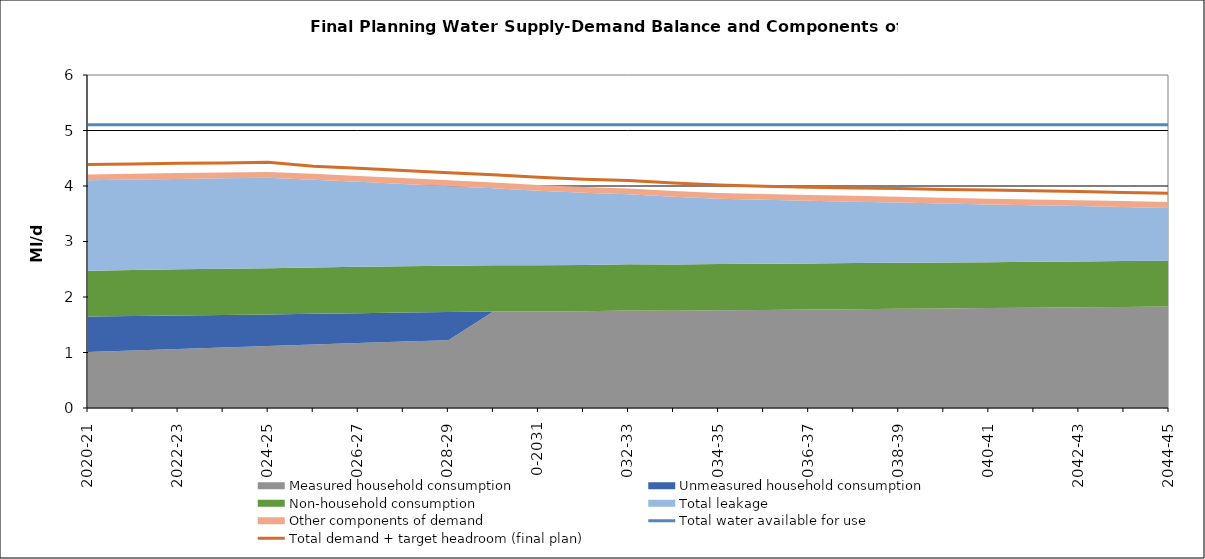
| Category | Total water available for use | Total demand + target headroom (final plan) |
|---|---|---|
| 0 | 5.102 | 4.387 |
| 1 | 5.102 | 4.399 |
| 2 | 5.102 | 4.408 |
| 3 | 5.102 | 4.416 |
| 4 | 5.102 | 4.428 |
| 5 | 5.102 | 4.355 |
| 6 | 5.102 | 4.32 |
| 7 | 5.102 | 4.281 |
| 8 | 5.102 | 4.24 |
| 9 | 5.102 | 4.203 |
| 10 | 5.102 | 4.157 |
| 11 | 5.102 | 4.12 |
| 12 | 5.102 | 4.099 |
| 13 | 5.102 | 4.052 |
| 14 | 5.102 | 4.019 |
| 15 | 5.102 | 3.996 |
| 16 | 5.102 | 3.979 |
| 17 | 5.102 | 3.965 |
| 18 | 5.102 | 3.954 |
| 19 | 5.102 | 3.939 |
| 20 | 5.102 | 3.926 |
| 21 | 5.102 | 3.914 |
| 22 | 5.102 | 3.901 |
| 23 | 5.102 | 3.883 |
| 24 | 5.102 | 3.87 |